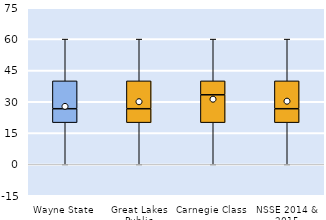
| Category | 25th | 50th | 75th |
|---|---|---|---|
| Wayne State | 20 | 6.667 | 13.333 |
| Great Lakes Public | 20 | 6.667 | 13.333 |
| Carnegie Class | 20 | 13.333 | 6.667 |
| NSSE 2014 & 2015 | 20 | 6.667 | 13.333 |